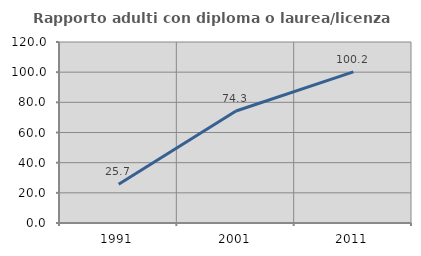
| Category | Rapporto adulti con diploma o laurea/licenza media  |
|---|---|
| 1991.0 | 25.705 |
| 2001.0 | 74.28 |
| 2011.0 | 100.159 |